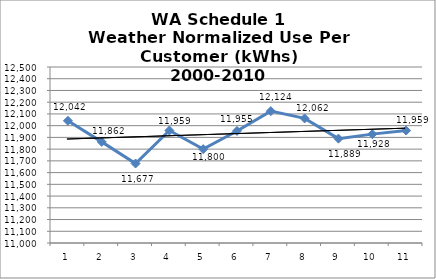
| Category | Series 0 |
|---|---|
| 0 | 12041.559 |
| 1 | 11861.932 |
| 2 | 11677.351 |
| 3 | 11958.804 |
| 4 | 11799.907 |
| 5 | 11954.909 |
| 6 | 12123.8 |
| 7 | 12061.971 |
| 8 | 11889.331 |
| 9 | 11927.905 |
| 10 | 11958.617 |